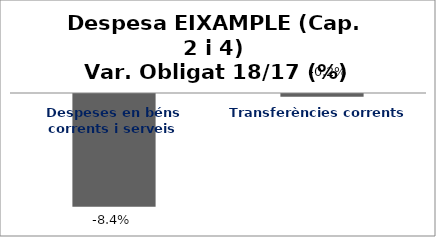
| Category | Series 0 |
|---|---|
| Despeses en béns corrents i serveis | -0.084 |
| Transferències corrents | -0.002 |